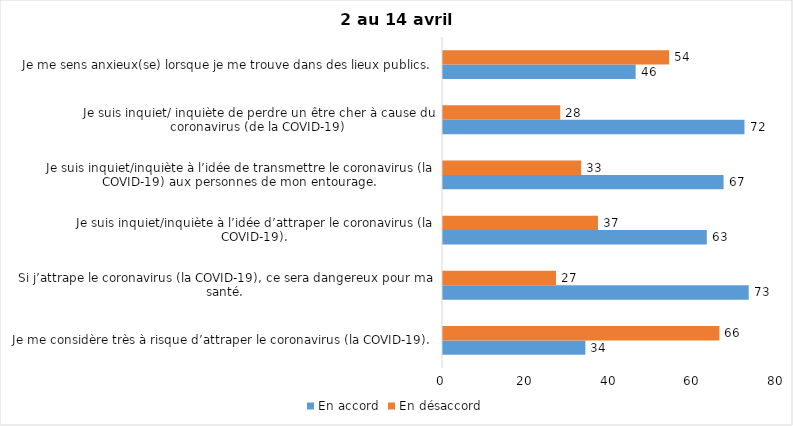
| Category | En accord | En désaccord |
|---|---|---|
| Je me considère très à risque d’attraper le coronavirus (la COVID-19). | 34 | 66 |
| Si j’attrape le coronavirus (la COVID-19), ce sera dangereux pour ma santé. | 73 | 27 |
| Je suis inquiet/inquiète à l’idée d’attraper le coronavirus (la COVID-19). | 63 | 37 |
| Je suis inquiet/inquiète à l’idée de transmettre le coronavirus (la COVID-19) aux personnes de mon entourage. | 67 | 33 |
| Je suis inquiet/ inquiète de perdre un être cher à cause du coronavirus (de la COVID-19) | 72 | 28 |
| Je me sens anxieux(se) lorsque je me trouve dans des lieux publics. | 46 | 54 |